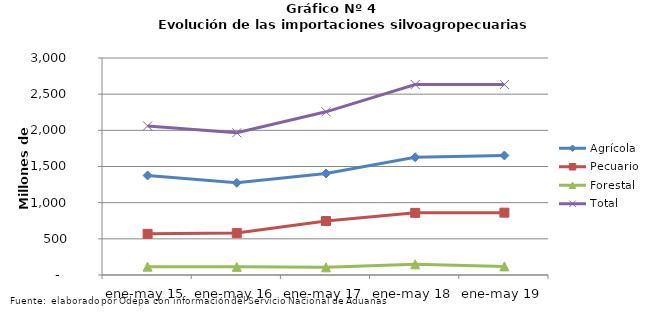
| Category | Agrícola | Pecuario | Forestal | Total |
|---|---|---|---|---|
| ene-may 15 | 1376871 | 569008 | 115533 | 2061412 |
| ene-may 16 | 1274150 | 579328 | 112607 | 1966085 |
| ene-may 17 | 1402598 | 746972 | 106491 | 2256061 |
| ene-may 18 | 1627377 | 859024 | 147250 | 2633651 |
| ene-may 19 | 1652179 | 862026 | 118852 | 2633057 |